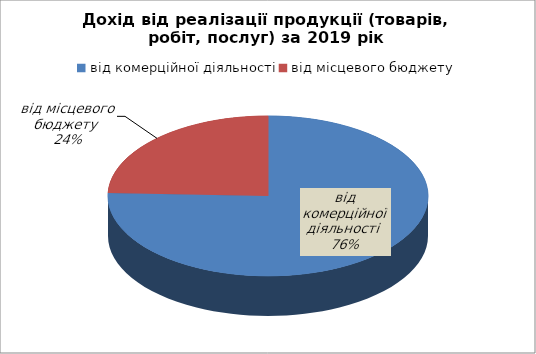
| Category | Series 0 |
|---|---|
| від комерційної діяльності | 75.6 |
| від місцевого бюджету | 24.4 |